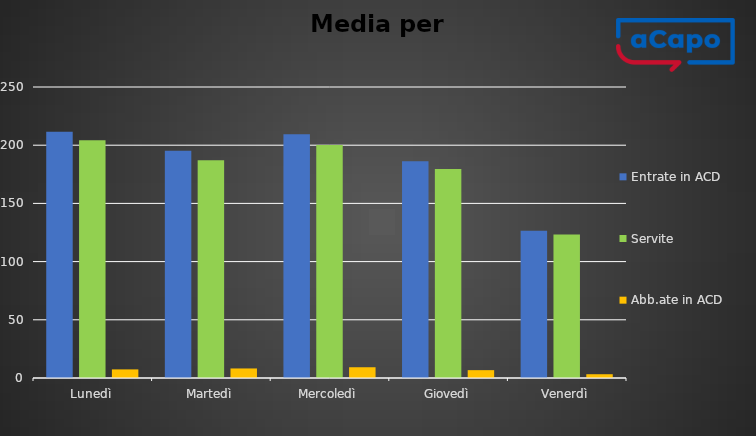
| Category | Entrate in ACD | Servite | Abb.ate in ACD |
|---|---|---|---|
| Lunedì | 211.6 | 204.2 | 7.4 |
| Martedì | 195.2 | 187 | 8.2 |
| Mercoledì | 209.5 | 200.25 | 9.25 |
| Giovedì | 186.25 | 179.5 | 6.75 |
| Venerdì | 126.5 | 123.25 | 3.25 |